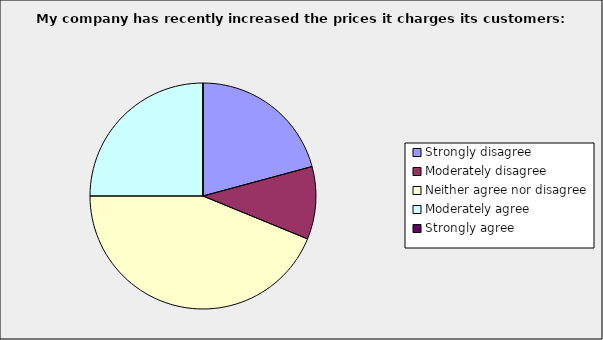
| Category | Series 0 |
|---|---|
| Strongly disagree | 0.208 |
| Moderately disagree | 0.104 |
| Neither agree nor disagree | 0.438 |
| Moderately agree | 0.25 |
| Strongly agree | 0 |